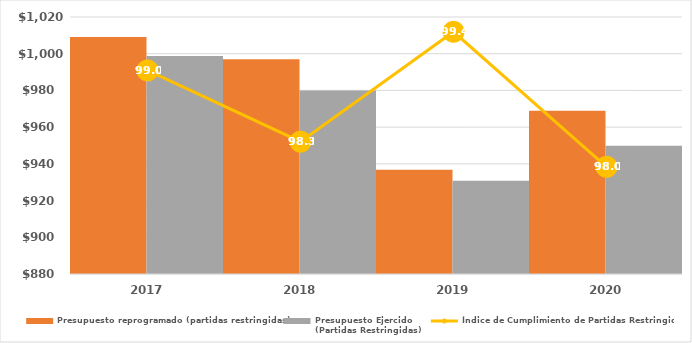
| Category | Presupuesto reprogramado (partidas restringidas) | Presupuesto Ejercido
(Partidas Restringidas) |
|---|---|---|
| 2017.0 | 1009095.712 | 998802.519 |
| 2018.0 | 996988 | 979910 |
| 2019.0 | 936775.686 | 930744.078 |
| 2020.0 | 968900.978 | 949931.095 |